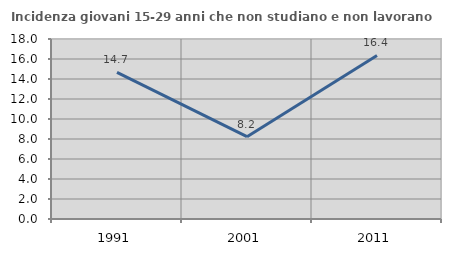
| Category | Incidenza giovani 15-29 anni che non studiano e non lavorano  |
|---|---|
| 1991.0 | 14.665 |
| 2001.0 | 8.232 |
| 2011.0 | 16.358 |